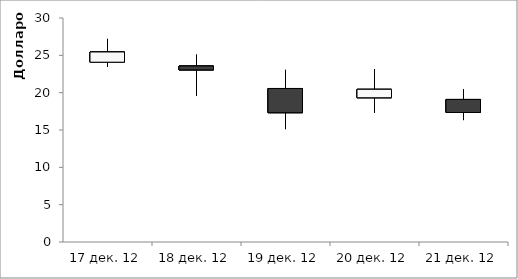
| Category | Открытие | Макс | Мин | Закрытие |
|---|---|---|---|---|
| 2012-12-17 | 24.08 | 27.2 | 23.49 | 25.45 |
| 2012-12-18 | 23.57 | 25.08 | 19.55 | 23.05 |
| 2012-12-19 | 20.56 | 23.05 | 15.12 | 17.32 |
| 2012-12-20 | 19.32 | 23.15 | 17.32 | 20.45 |
| 2012-12-21 | 19.09 | 20.45 | 16.33 | 17.35 |